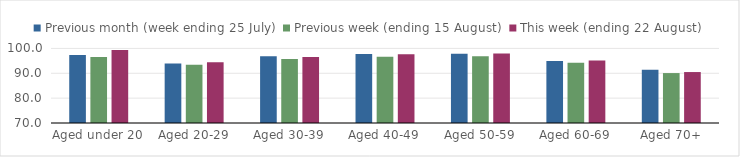
| Category | Previous month (week ending 25 July) | Previous week (ending 15 August) | This week (ending 22 August) |
|---|---|---|---|
| Aged under 20 | 97.313 | 96.573 | 99.329 |
| Aged 20-29 | 93.893 | 93.483 | 94.422 |
| Aged 30-39 | 96.826 | 95.776 | 96.518 |
| Aged 40-49 | 97.757 | 96.674 | 97.627 |
| Aged 50-59 | 97.854 | 96.891 | 97.955 |
| Aged 60-69 | 94.946 | 94.211 | 95.15 |
| Aged 70+ | 91.408 | 90.088 | 90.497 |